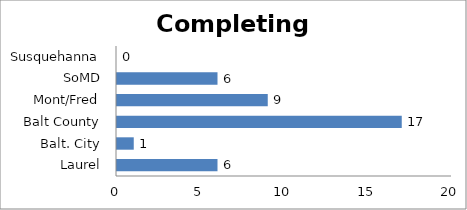
| Category | Completing Training |
|---|---|
| Laurel | 6 |
| Balt. City | 1 |
| Balt County | 17 |
| Mont/Fred | 9 |
| SoMD | 6 |
| Susquehanna | 0 |